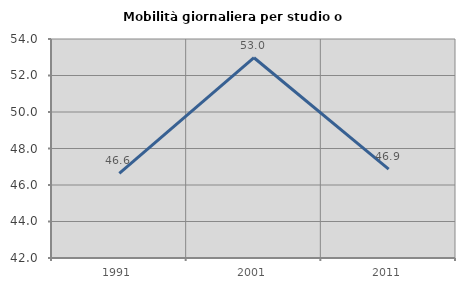
| Category | Mobilità giornaliera per studio o lavoro |
|---|---|
| 1991.0 | 46.639 |
| 2001.0 | 52.974 |
| 2011.0 | 46.872 |